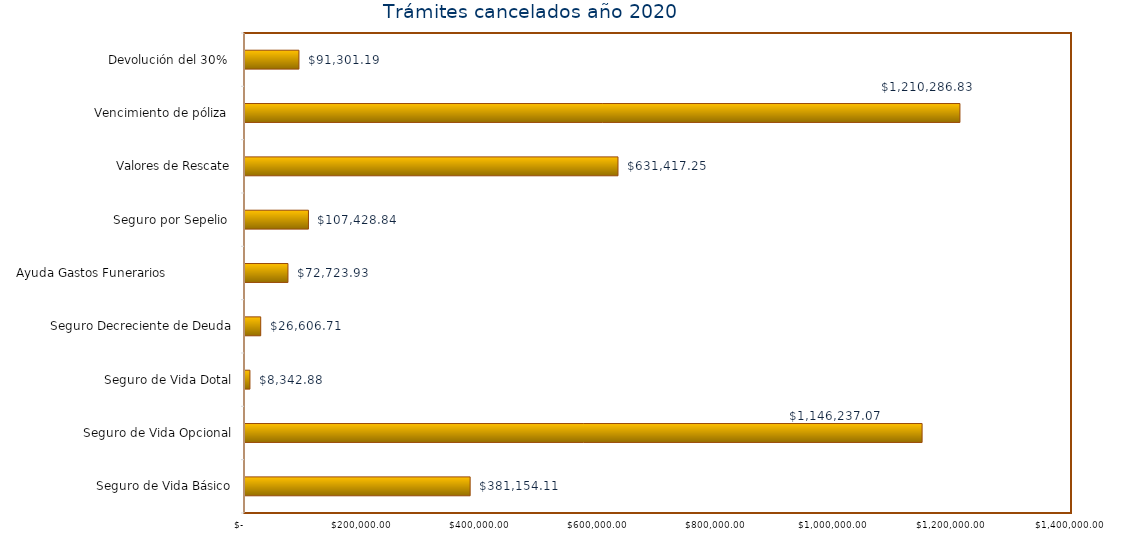
| Category | Monto  |
|---|---|
| Seguro de Vida Básico | 381154.11 |
| Seguro de Vida Opcional | 1146237.07 |
| Seguro de Vida Dotal | 8342.88 |
| Seguro Decreciente de Deuda | 26606.71 |
| Ayuda Gastos Funerarios                  | 72723.93 |
| Seguro por Sepelio  | 107428.84 |
| Valores de Rescate | 631417.25 |
| Vencimiento de póliza  | 1210286.83 |
| Devolución del 30%  | 91301.19 |